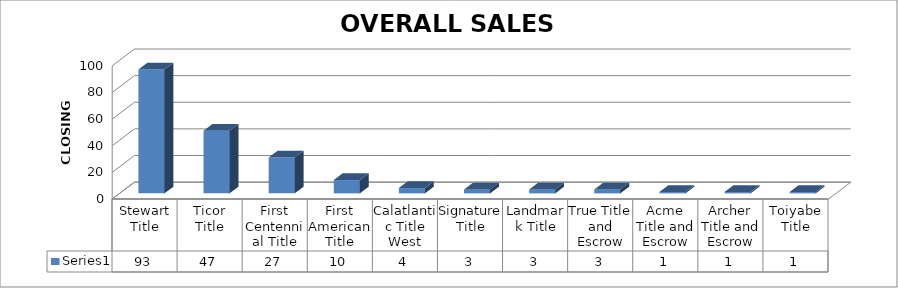
| Category | Series 0 |
|---|---|
| Stewart Title | 93 |
| Ticor Title | 47 |
| First Centennial Title | 27 |
| First American Title | 10 |
| Calatlantic Title West | 4 |
| Signature Title | 3 |
| Landmark Title | 3 |
| True Title and Escrow | 3 |
| Acme Title and Escrow | 1 |
| Archer Title and Escrow | 1 |
| Toiyabe Title | 1 |